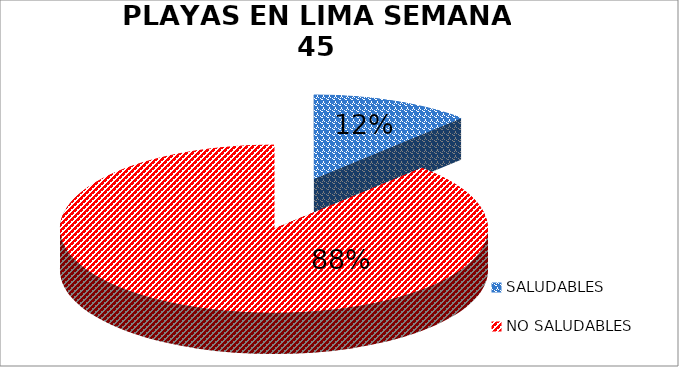
| Category | N.° |
|---|---|
| SALUDABLES | 7 |
| NO SALUDABLES | 51 |